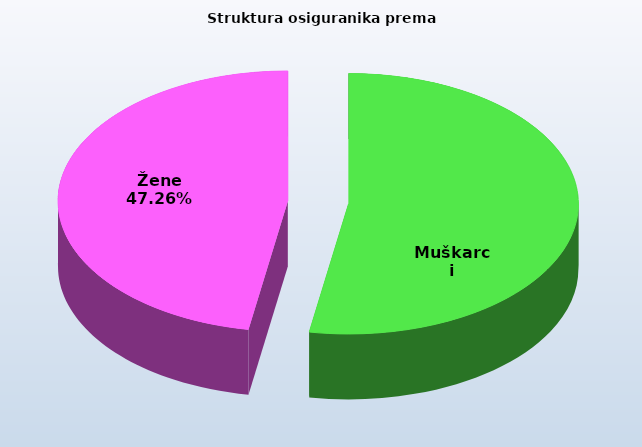
| Category | Series 0 |
|---|---|
| Muškarci | 840387 |
| Žene | 753196 |